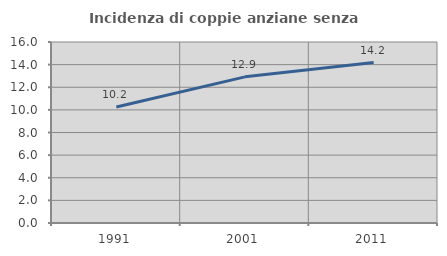
| Category | Incidenza di coppie anziane senza figli  |
|---|---|
| 1991.0 | 10.249 |
| 2001.0 | 12.919 |
| 2011.0 | 14.184 |